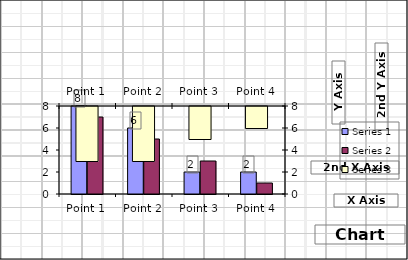
| Category | Series 1 | Series 2 |
|---|---|---|
| Point 1 | 8 | 7 |
| Point 2 | 6 | 5 |
| Point 3 | 2 | 3 |
| Point 4 | 2 | 1 |